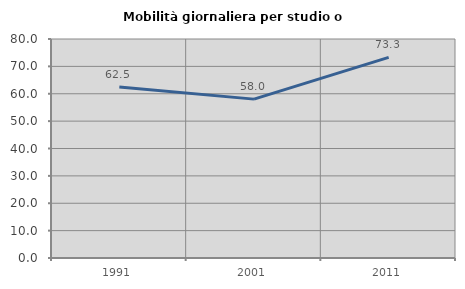
| Category | Mobilità giornaliera per studio o lavoro |
|---|---|
| 1991.0 | 62.5 |
| 2001.0 | 58.036 |
| 2011.0 | 73.267 |